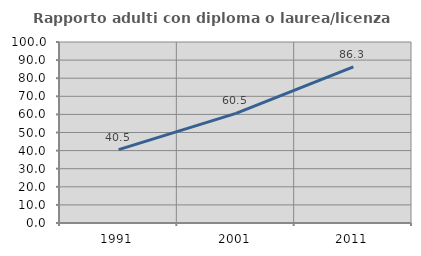
| Category | Rapporto adulti con diploma o laurea/licenza media  |
|---|---|
| 1991.0 | 40.548 |
| 2001.0 | 60.539 |
| 2011.0 | 86.262 |